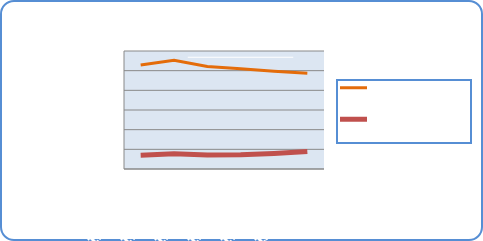
| Category | Motorin Türleri  | Benzin Türleri |
|---|---|---|
| 11/26/18 | 52897230.905 | 7053945.293 |
| 11/27/18 | 55343314.445 | 7690644.061 |
| 11/28/18 | 52081718.372 | 7166675.062 |
| 11/29/18 | 50938779.029 | 7228354.44 |
| 11/30/18 | 49716488.498 | 7899163.005 |
| 12/1/18 | 48738312.758 | 8935458.485 |